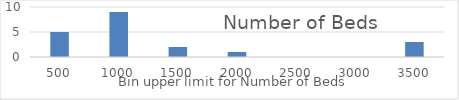
| Category | Series 0 |
|---|---|
| 500.0 | 5 |
| 1000.0 | 9 |
| 1500.0 | 2 |
| 2000.0 | 1 |
| 2500.0 | 0 |
| 3000.0 | 0 |
| 3500.0 | 3 |